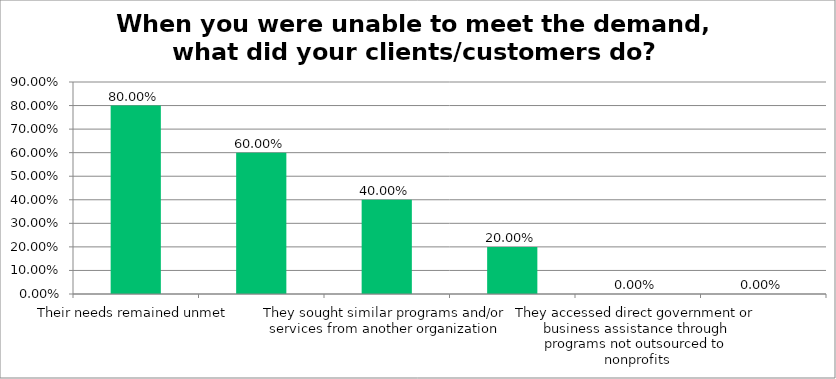
| Category | Responses |
|---|---|
| Their needs remained unmet | 0.8 |
| They sought assistance from personal networks (family, friends, etc.) | 0.6 |
| They sought similar programs and/or services from another organization | 0.4 |
| Other | 0.2 |
| They accessed direct government or business assistance through programs not outsourced to nonprofits | 0 |
| Don't know | 0 |